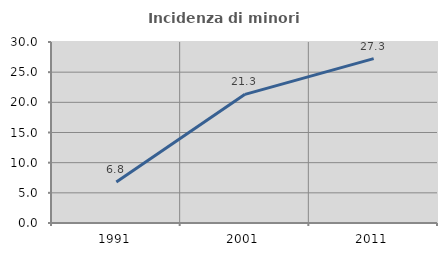
| Category | Incidenza di minori stranieri |
|---|---|
| 1991.0 | 6.78 |
| 2001.0 | 21.321 |
| 2011.0 | 27.251 |